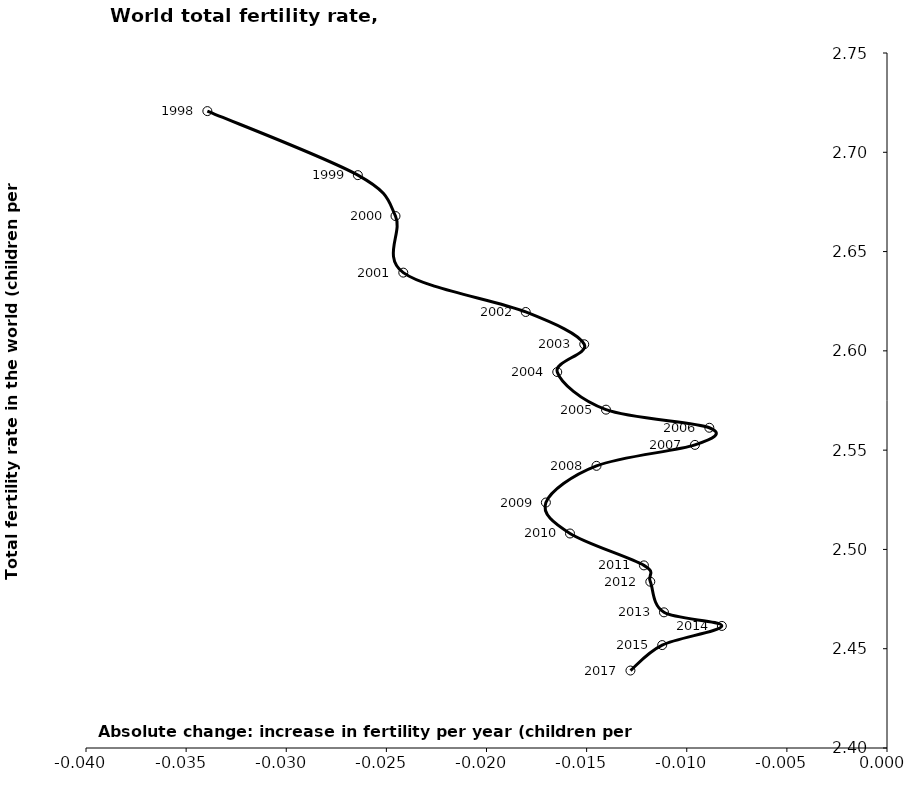
| Category | Series 0 |
|---|---|
| -0.033939855385244355 | 2.721 |
| -0.026424135598765996 | 2.688 |
| -0.024543976263827982 | 2.668 |
| -0.024155424545941218 | 2.639 |
| -0.01804088143451965 | 2.62 |
| -0.015118970011812172 | 2.603 |
| -0.016467289097373605 | 2.589 |
| -0.01403304779822423 | 2.57 |
| -0.008872670617024125 | 2.561 |
| -0.009591624461738002 | 2.553 |
| -0.014507027634991898 | 2.542 |
| -0.017034263577475173 | 2.524 |
| -0.01583083564309251 | 2.508 |
| -0.012139164611035591 | 2.492 |
| -0.011820378192050063 | 2.484 |
| -0.01113758416060251 | 2.468 |
| -0.008247175720514699 | 2.461 |
| -0.01122647747695149 | 2.452 |
| -0.012811859931843639 | 2.439 |